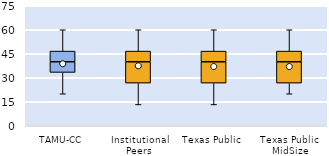
| Category | 25th | 50th | 75th |
|---|---|---|---|
| TAMU-CC | 33.333 | 6.667 | 6.667 |
| Institutional Peers | 26.667 | 13.333 | 6.667 |
| Texas Public | 26.667 | 13.333 | 6.667 |
| Texas Public MidSize | 26.667 | 13.333 | 6.667 |